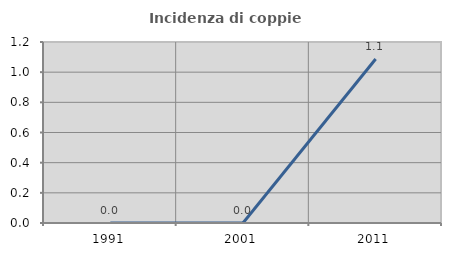
| Category | Incidenza di coppie miste |
|---|---|
| 1991.0 | 0 |
| 2001.0 | 0 |
| 2011.0 | 1.087 |